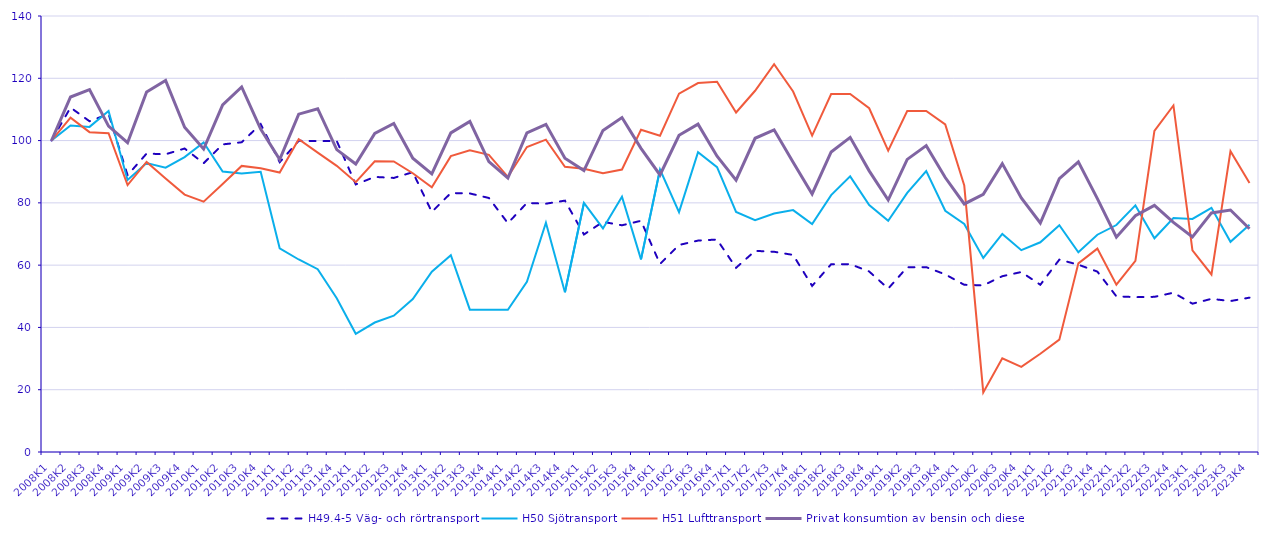
| Category | H49.4-5 Väg- och rörtransport  | H50 Sjötransport | H51 Lufttransport | Privat konsumtion av bensin och diesel |
|---|---|---|---|---|
| 2008K1 | 100 | 100 | 100 | 100 |
| 2008K2 | 110.605 | 104.821 | 107.336 | 113.989 |
| 2008K3 | 106.202 | 104.395 | 102.7 | 116.352 |
| 2008K4 | 108.545 | 109.488 | 102.341 | 104.648 |
| 2009K1 | 88.884 | 87.365 | 85.731 | 99.305 |
| 2009K2 | 95.821 | 92.761 | 93.152 | 115.592 |
| 2009K3 | 95.605 | 91.313 | 87.79 | 119.283 |
| 2009K4 | 97.448 | 94.711 | 82.65 | 104.271 |
| 2010K1 | 92.718 | 99.361 | 80.378 | 97.28 |
| 2010K2 | 98.769 | 90.079 | 86.085 | 111.454 |
| 2010K3 | 99.453 | 89.447 | 91.863 | 117.221 |
| 2010K4 | 105.275 | 89.961 | 91.101 | 103.716 |
| 2011K1 | 93.05 | 65.416 | 89.751 | 93.922 |
| 2011K2 | 99.926 | 61.816 | 100.458 | 108.476 |
| 2011K3 | 99.842 | 58.702 | 96.148 | 110.238 |
| 2011K4 | 99.876 | 49.376 | 91.881 | 97.096 |
| 2012K1 | 85.918 | 37.962 | 86.65 | 92.472 |
| 2012K2 | 88.33 | 41.576 | 93.355 | 102.275 |
| 2012K3 | 88.002 | 43.781 | 93.303 | 105.469 |
| 2012K4 | 89.85 | 49.11 | 89.515 | 94.318 |
| 2013K1 | 77.07 | 57.912 | 85.009 | 89.286 |
| 2013K2 | 83.16 | 63.192 | 95.009 | 102.466 |
| 2013K3 | 83.017 | 45.709 | 96.878 | 106.155 |
| 2013K4 | 81.569 | 45.685 | 95.424 | 93.259 |
| 2014K1 | 73.486 | 45.642 | 88.328 | 87.974 |
| 2014K2 | 79.972 | 54.666 | 97.912 | 102.445 |
| 2014K3 | 79.733 | 73.6 | 100.306 | 105.203 |
| 2014K4 | 80.713 | 51.276 | 91.598 | 94.332 |
| 2015K1 | 69.85 | 79.96 | 90.98 | 90.351 |
| 2015K2 | 73.898 | 71.793 | 89.538 | 103.248 |
| 2015K3 | 72.799 | 82.003 | 90.697 | 107.388 |
| 2015K4 | 74.241 | 61.857 | 103.45 | 97.498 |
| 2016K1 | 60.384 | 90.683 | 101.573 | 88.963 |
| 2016K2 | 66.476 | 77.03 | 115.085 | 101.711 |
| 2016K3 | 67.883 | 96.262 | 118.465 | 105.276 |
| 2016K4 | 68.223 | 91.473 | 118.88 | 94.969 |
| 2017K1 | 59.151 | 77.071 | 109.027 | 87.313 |
| 2017K2 | 64.586 | 74.472 | 115.991 | 100.742 |
| 2017K3 | 64.295 | 76.562 | 124.539 | 103.441 |
| 2017K4 | 63.28 | 77.668 | 115.751 | 93.063 |
| 2018K1 | 53.328 | 73.165 | 101.591 | 82.868 |
| 2018K2 | 60.291 | 82.485 | 114.949 | 96.33 |
| 2018K3 | 60.329 | 88.517 | 114.98 | 101.026 |
| 2018K4 | 57.958 | 79.272 | 110.388 | 90.275 |
| 2019K1 | 52.474 | 74.223 | 96.783 | 80.905 |
| 2019K2 | 59.323 | 83.218 | 109.491 | 93.953 |
| 2019K3 | 59.358 | 90.21 | 109.515 | 98.37 |
| 2019K4 | 57.028 | 77.465 | 105.17 | 88.129 |
| 2020K1 | 53.682 | 73.247 | 85.561 | 79.645 |
| 2020K2 | 53.513 | 62.312 | 19.148 | 82.746 |
| 2020K3 | 56.449 | 70.041 | 30.088 | 92.602 |
| 2020K4 | 57.788 | 64.818 | 27.349 | 81.583 |
| 2021K1 | 53.694 | 67.338 | 31.545 | 73.533 |
| 2021K2 | 61.772 | 72.839 | 36.07 | 87.766 |
| 2021K3 | 60.143 | 64.153 | 60.569 | 93.176 |
| 2021K4 | 57.922 | 69.764 | 65.31 | 81.36 |
| 2022K1 | 49.989 | 72.884 | 53.74 | 68.997 |
| 2022K2 | 49.722 | 79.179 | 61.402 | 75.874 |
| 2022K3 | 49.819 | 68.638 | 103.138 | 79.203 |
| 2022K4 | 51.141 | 75.126 | 111.281 | 73.718 |
| 2023K1 | 47.626 | 74.823 | 64.724 | 69.085 |
| 2023K2 | 49.169 | 78.386 | 57.001 | 76.767 |
| 2023K3 | 48.47 | 67.478 | 96.609 | 77.696 |
| 2023K4 | 49.564 | 72.959 | 86.367 | 71.699 |